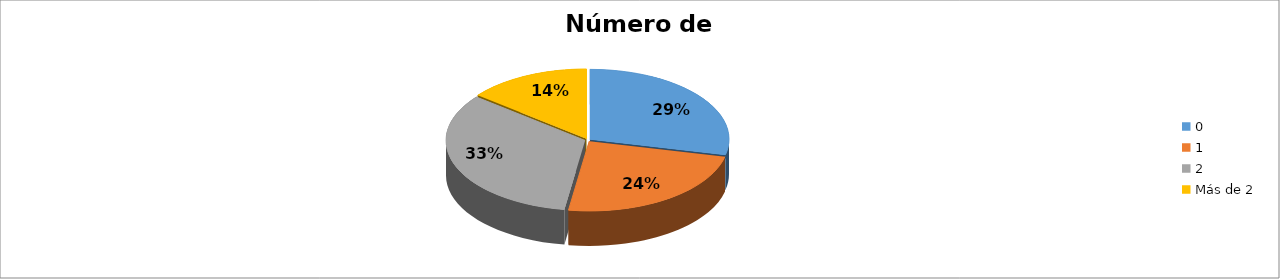
| Category | Series 0 |
|---|---|
| 0 | 0.286 |
| 1 | 0.238 |
| 2 | 0.333 |
| Más de 2 | 0.143 |